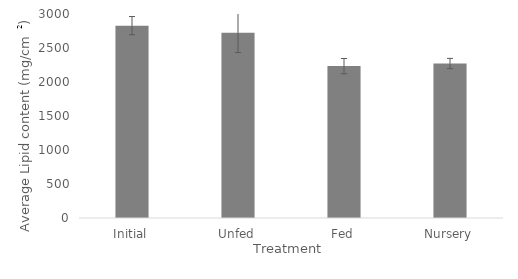
| Category | average final lipid content |
|---|---|
| Initial | 2828.58 |
| Unfed | 2725.938 |
| Fed | 2233.614 |
| Nursery | 2271.719 |